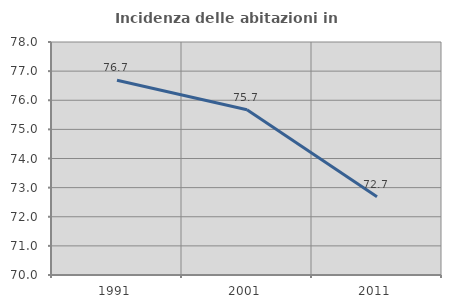
| Category | Incidenza delle abitazioni in proprietà  |
|---|---|
| 1991.0 | 76.685 |
| 2001.0 | 75.676 |
| 2011.0 | 72.685 |